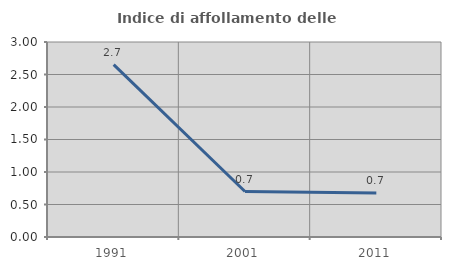
| Category | Indice di affollamento delle abitazioni  |
|---|---|
| 1991.0 | 2.652 |
| 2001.0 | 0.699 |
| 2011.0 | 0.676 |